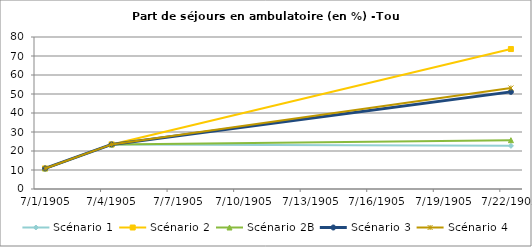
| Category | Scénario 1 | Scénario 2 | Scénario 2B | Scénario 3 | Scénario 4 |
|---|---|---|---|---|---|
| 2009.0 | 10.823 | 10.823 | 10.823 | 10.823 | 10.823 |
| 2012.0 | 23.47 | 23.47 | 23.47 | 23.47 | 23.47 |
| 2030.0 | 22.711 | 73.664 | 25.69 | 51.115 | 53.161 |